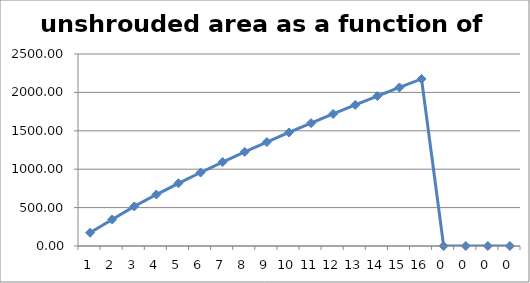
| Category | unshrouded area as a function of valvelift |
|---|---|
| 1.0 | 172.788 |
| 2.0 | 345.575 |
| 3.0 | 515.225 |
| 4.0 | 669.989 |
| 5.0 | 816.505 |
| 6.0 | 957.12 |
| 7.0 | 1092.968 |
| 8.0 | 1224.761 |
| 9.0 | 1353 |
| 10.0 | 1478.06 |
| 11.0 | 1600.236 |
| 12.0 | 1719.766 |
| 13.0 | 1836.848 |
| 14.0 | 1951.648 |
| 15.0 | 2064.307 |
| 16.0 | 2174.95 |
| 0.0 | 0 |
| 0.0 | 0 |
| 0.0 | 0 |
| 0.0 | 0 |